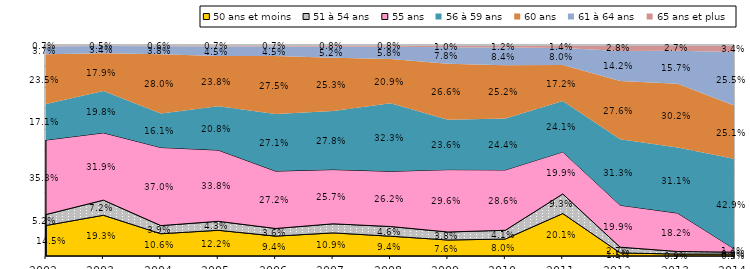
| Category | 50 ans et moins | 51 à 54 ans | 55 ans | 56 à 59 ans | 60 ans | 61 à 64 ans | 65 ans et plus |
|---|---|---|---|---|---|---|---|
| 2002.0 | 0.145 | 0.052 | 0.353 | 0.171 | 0.235 | 0.037 | 0.007 |
| 2003.0 | 0.193 | 0.072 | 0.319 | 0.198 | 0.179 | 0.034 | 0.005 |
| 2004.0 | 0.106 | 0.039 | 0.37 | 0.161 | 0.28 | 0.038 | 0.006 |
| 2005.0 | 0.122 | 0.043 | 0.338 | 0.208 | 0.238 | 0.045 | 0.007 |
| 2006.0 | 0.094 | 0.036 | 0.272 | 0.271 | 0.275 | 0.045 | 0.007 |
| 2007.0 | 0.109 | 0.043 | 0.257 | 0.278 | 0.253 | 0.052 | 0.008 |
| 2008.0 | 0.094 | 0.046 | 0.262 | 0.323 | 0.209 | 0.058 | 0.008 |
| 2009.0 | 0.076 | 0.038 | 0.296 | 0.236 | 0.266 | 0.078 | 0.01 |
| 2010.0 | 0.08 | 0.041 | 0.286 | 0.244 | 0.252 | 0.084 | 0.012 |
| 2011.0 | 0.201 | 0.093 | 0.199 | 0.241 | 0.172 | 0.08 | 0.014 |
| 2012.0 | 0.015 | 0.027 | 0.199 | 0.313 | 0.276 | 0.142 | 0.028 |
| 2013.0 | 0.009 | 0.012 | 0.182 | 0.311 | 0.302 | 0.157 | 0.027 |
| 2014.0 | 0.009 | 0.009 | 0.014 | 0.429 | 0.251 | 0.255 | 0.034 |